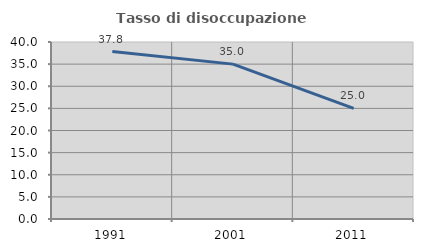
| Category | Tasso di disoccupazione giovanile  |
|---|---|
| 1991.0 | 37.838 |
| 2001.0 | 35 |
| 2011.0 | 25 |